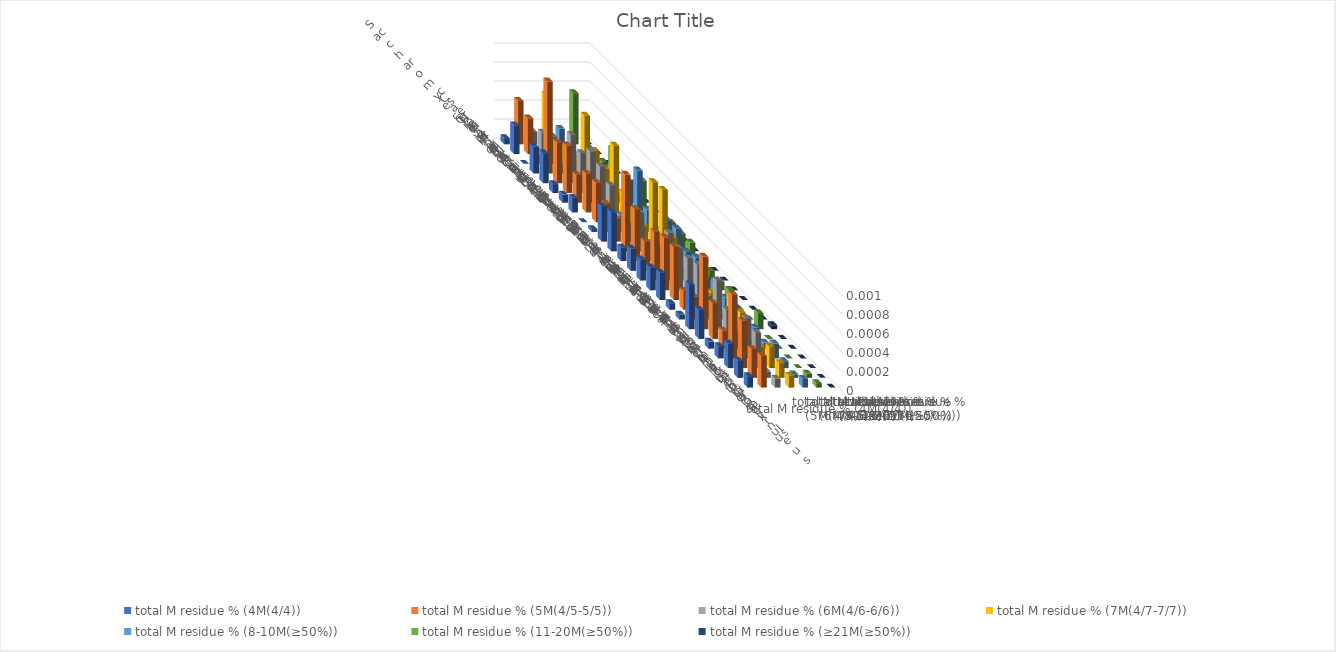
| Category | total M residue % (4M(4/4)) | total M residue % (5M(4/5-5/5)) | total M residue % (6M(4/6-6/6)) | total M residue % (7M(4/7-7/7)) | total M residue % (8-10M(≥50%)) | total M residue % (11-20M(≥50%)) | total M residue % (≥21M(≥50%)) |
|---|---|---|---|---|---|---|---|
| Saccharomyces cerevisiae S288c | 0 | 0 | 0 | 0.001 | 0 | 0.001 | 0 |
| Candida albicans | 0 | 0 | 0 | 0 | 0 | 0 | 0 |
| Candida auris | 0 | 0 | 0 | 0 | 0 | 0 | 0 |
| Candida tropicalis | 0 | 0.001 | 0 | 0 | 0 | 0 | 0 |
| Neurospora crassa | 0 | 0 | 0.001 | 0.001 | 0 | 0 | 0 |
| Magnaporthe oryzae | 0 | 0 | 0 | 0 | 0 | 0 | 0 |
| Trichoderma reesei | 0 | 0 | 0.001 | 0 | 0 | 0 | 0 |
| Cryptococcus neoformans | 0 | 0 | 0 | 0.001 | 0 | 0 | 0 |
| Ustilago maydis | 0 | 0 | 0 | 0 | 0.001 | 0 | 0 |
| Taiwanofungus camphoratus | 0 | 0 | 0 | 0 | 0 | 0 | 0 |
| Dictyostelium discoideum | 0 | 0 | 0 | 0 | 0 | 0 | 0 |
| Chlamydomonas reinhardtii | 0 | 0.001 | 0 | 0.001 | 0 | 0 | 0 |
| Drosophila melanogaster | 0 | 0.001 | 0 | 0.001 | 0 | 0 | 0 |
| Aedes aegypti | 0 | 0 | 0 | 0 | 0 | 0 | 0 |
| Plasmodium falciparum | 0 | 0.001 | 0.001 | 0 | 0 | 0 | 0 |
| Caenorhabditis elegans | 0 | 0.001 | 0 | 0 | 0 | 0 | 0 |
| Danio rerio | 0 | 0.001 | 0 | 0 | 0 | 0 | 0 |
| Mus musculus | 0 | 0 | 0 | 0 | 0 | 0 | 0 |
| Homo sapiens | 0 | 0 | 0 | 0 | 0 | 0 | 0 |
| Arabidopsis thaliana | 0 | 0.001 | 0.001 | 0 | 0 | 0 | 0 |
| Tetrahymena thermophila | 0 | 0 | 0 | 0 | 0 | 0 | 0 |
| Paramecium tetraurelia | 0 | 0 | 0 | 0 | 0 | 0 | 0 |
| Oxytricha trifallax | 0 | 0.001 | 0 | 0 | 0 | 0 | 0 |
| Stylonychia lemnae | 0 | 0 | 0 | 0 | 0 | 0 | 0 |
| Pseudocohnilembus persalinus | 0 | 0 | 0 | 0 | 0 | 0 | 0 |
| Stentor coeruleus | 0 | 0 | 0 | 0 | 0 | 0 | 0 |